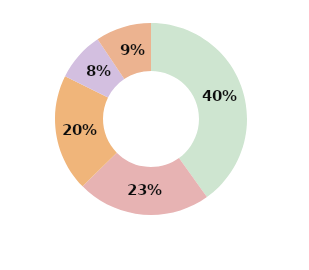
| Category | Series 0 |
|---|---|
| Transportation | 0.401 |
| Lodging | 0.225 |
| Food | 0.197 |
| Entertainment | 0.083 |
| Other | 0.094 |